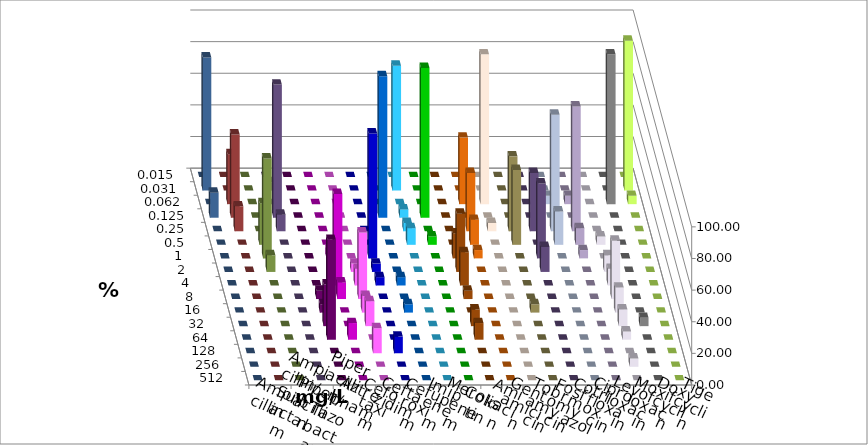
| Category | Ampicillin | Ampicillin/ Sulbactam | Piperacillin | Piperacillin/ Tazobactam | Aztreonam | Cefotaxim | Ceftazidim | Cefuroxim | Imipenem | Meropenem | Colistin | Amikacin | Gentamicin | Tobramycin | Fosfomycin | Cotrimoxazol | Ciprofloxacin | Levofloxacin | Moxifloxacin | Doxycyclin | Tigecyclin |
|---|---|---|---|---|---|---|---|---|---|---|---|---|---|---|---|---|---|---|---|---|---|
| 0.015 | 0 | 0 | 0 | 0 | 0 | 0 | 0 | 0 | 0 | 0 | 0 | 0 | 0 | 0 | 0 | 0 | 0 | 0 | 0 | 0 | 0 |
| 0.031 | 0 | 0 | 0 | 0 | 0 | 78.947 | 0 | 0 | 0 | 0 | 0 | 0 | 0 | 0 | 0 | 0 | 94.737 | 84.211 | 0 | 0 | 5.263 |
| 0.062 | 0 | 0 | 0 | 0 | 0 | 0 | 0 | 0 | 42.105 | 94.737 | 0 | 0 | 5.263 | 5.263 | 0 | 94.737 | 5.263 | 0 | 31.579 | 0 | 0 |
| 0.125 | 0 | 0 | 0 | 0 | 89.474 | 5.263 | 94.737 | 0 | 0 | 0 | 0 | 0 | 0 | 0 | 0 | 0 | 0 | 15.789 | 52.632 | 0 | 84.211 |
| 0.25 | 0 | 0 | 0 | 0 | 0 | 5.263 | 0 | 0 | 36.842 | 5.263 | 47.368 | 36.842 | 73.684 | 78.947 | 0 | 0 | 0 | 0 | 15.789 | 0 | 10.526 |
| 0.5 | 0 | 0 | 0 | 0 | 0 | 10.526 | 5.263 | 0 | 15.789 | 0 | 47.368 | 0 | 21.053 | 10.526 | 5.263 | 0 | 0 | 0 | 0 | 26.316 | 0 |
| 1.0 | 0 | 5.263 | 0 | 78.947 | 0 | 0 | 0 | 15.789 | 5.263 | 0 | 0 | 47.368 | 0 | 5.263 | 0 | 0 | 0 | 0 | 0 | 63.158 | 0 |
| 2.0 | 0 | 15.789 | 5.263 | 5.263 | 0 | 0 | 0 | 36.842 | 0 | 0 | 0 | 15.789 | 0 | 0 | 10.526 | 0 | 0 | 0 | 0 | 10.526 | 0 |
| 4.0 | 0 | 57.895 | 10.526 | 5.263 | 5.263 | 0 | 0 | 21.053 | 0 | 0 | 0 | 0 | 0 | 0 | 10.526 | 0 | 0 | 0 | 0 | 0 | 0 |
| 8.0 | 5.263 | 10.526 | 42.105 | 0 | 0 | 0 | 0 | 5.263 | 0 | 0 | 0 | 0 | 0 | 0 | 36.842 | 0 | 0 | 0 | 0 | 0 | 0 |
| 16.0 | 5.263 | 0 | 10.526 | 0 | 5.263 | 0 | 0 | 0 | 0 | 0 | 5.263 | 0 | 0 | 0 | 15.789 | 0 | 0 | 0 | 0 | 0 | 0 |
| 32.0 | 26.316 | 0 | 15.789 | 0 | 0 | 0 | 0 | 10.526 | 0 | 0 | 0 | 0 | 0 | 0 | 10.526 | 5.263 | 0 | 0 | 0 | 0 | 0 |
| 64.0 | 63.158 | 10.526 | 0 | 0 | 0 | 0 | 0 | 10.526 | 0 | 0 | 0 | 0 | 0 | 0 | 5.263 | 0 | 0 | 0 | 0 | 0 | 0 |
| 128.0 | 0 | 0 | 15.789 | 10.526 | 0 | 0 | 0 | 0 | 0 | 0 | 0 | 0 | 0 | 0 | 0 | 0 | 0 | 0 | 0 | 0 | 0 |
| 256.0 | 0 | 0 | 0 | 0 | 0 | 0 | 0 | 0 | 0 | 0 | 0 | 0 | 0 | 0 | 5.263 | 0 | 0 | 0 | 0 | 0 | 0 |
| 512.0 | 0 | 0 | 0 | 0 | 0 | 0 | 0 | 0 | 0 | 0 | 0 | 0 | 0 | 0 | 0 | 0 | 0 | 0 | 0 | 0 | 0 |